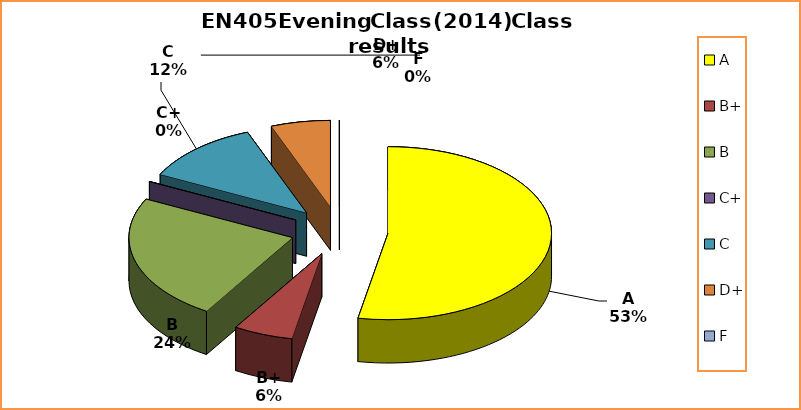
| Category | Series 0 |
|---|---|
| A | 9 |
| B+ | 1 |
| B | 4 |
| C+ | 0 |
| C | 2 |
| D+ | 1 |
| F | 0 |